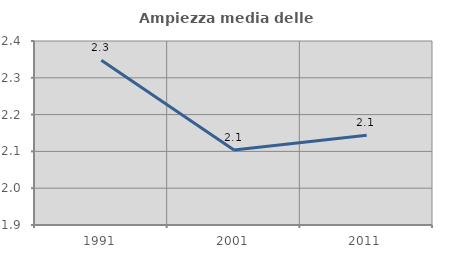
| Category | Ampiezza media delle famiglie |
|---|---|
| 1991.0 | 2.348 |
| 2001.0 | 2.104 |
| 2011.0 | 2.144 |